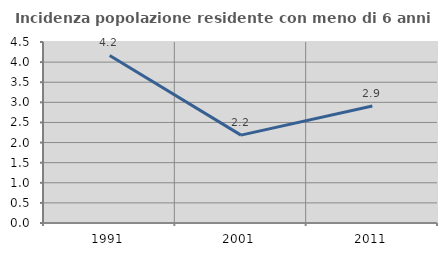
| Category | Incidenza popolazione residente con meno di 6 anni |
|---|---|
| 1991.0 | 4.167 |
| 2001.0 | 2.185 |
| 2011.0 | 2.911 |